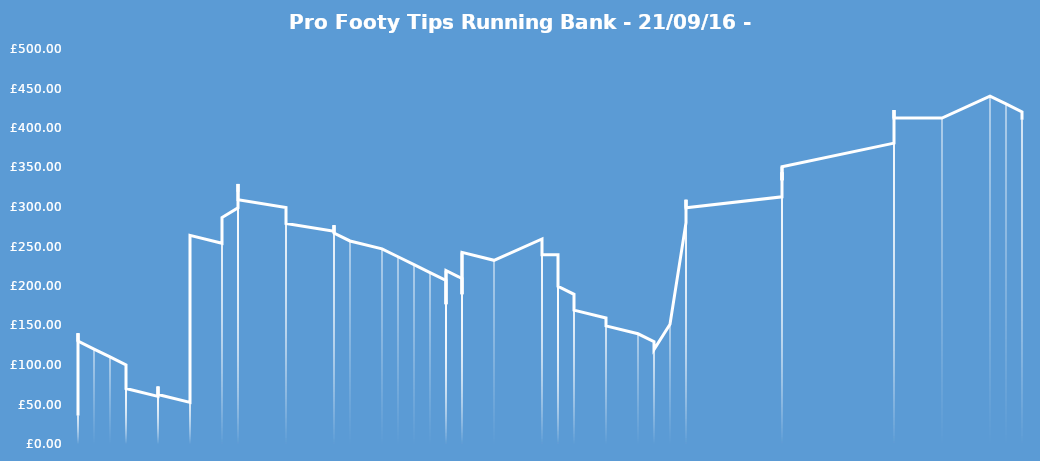
| Category | Running Bank |
|---|---|
| 9/22/16 | 36 |
| 9/22/16 | 49 |
| 9/22/16 | 140.2 |
| 9/22/16 | 140.2 |
| 9/22/16 | 130.2 |
| 9/23/16 | 120.2 |
| 9/24/16 | 110.2 |
| 9/25/16 | 100.2 |
| 9/25/16 | 90.2 |
| 9/25/16 | 80.2 |
| 9/25/16 | 80.2 |
| 9/25/16 | 70.2 |
| 9/27/16 | 60.2 |
| 9/27/16 | 72.7 |
| 9/27/16 | 62.7 |
| 9/27/16 | 62.7 |
| 9/29/16 | 52.7 |
| 9/29/16 | 66.46 |
| 9/29/16 | 121.46 |
| 9/29/16 | 264.16 |
| 9/29/16 | 264.16 |
| 10/1/16 | 254.16 |
| 10/1/16 | 272.16 |
| 10/1/16 | 286.66 |
| 10/2/16 | 298.86 |
| 10/2/16 | 329.26 |
| 10/2/16 | 329.26 |
| 10/2/16 | 319.26 |
| 10/2/16 | 309.26 |
| 10/5/16 | 299.26 |
| 10/5/16 | 289.26 |
| 10/5/16 | 279.26 |
| 10/8/16 | 269.26 |
| 10/8/16 | 277.01 |
| 10/8/16 | 267.01 |
| 10/9/16 | 257.01 |
| 10/11/16 | 247.01 |
| 10/12/16 | 237.01 |
| 10/13/16 | 227.01 |
| 10/14/16 | 217.01 |
| 10/15/16 | 207.01 |
| 10/15/16 | 197.01 |
| 10/15/16 | 187.01 |
| 10/15/16 | 187.01 |
| 10/15/16 | 177.01 |
| 10/15/16 | 219.51 |
| 10/16/16 | 209.51 |
| 10/16/16 | 199.51 |
| 10/16/16 | 189.51 |
| 10/16/16 | 189.51 |
| 10/16/16 | 242.51 |
| 10/18/16 | 232.51 |
| 10/21/16 | 259.51 |
| 10/21/16 | 249.51 |
| 10/21/16 | 239.51 |
| 10/21/16 | 239.51 |
| 10/22/16 | 239.51 |
| 10/22/16 | 229.51 |
| 10/22/16 | 219.51 |
| 10/22/16 | 219.51 |
| 10/22/16 | 209.51 |
| 10/22/16 | 199.51 |
| 10/23/16 | 189.51 |
| 10/23/16 | 179.51 |
| 10/23/16 | 169.51 |
| 10/25/16 | 159.51 |
| 10/25/16 | 149.51 |
| 10/27/16 | 139.51 |
| 10/28/16 | 129.51 |
| 10/28/16 | 119.51 |
| 10/29/16 | 151.51 |
| 10/30/16 | 280.11 |
| 10/30/16 | 280.11 |
| 10/30/16 | 309.11 |
| 10/30/16 | 299.11 |
| 11/5/16 | 312.86 |
| 11/5/16 | 343.86 |
| 11/5/16 | 333.86 |
| 11/5/16 | 350.86 |
| 11/12/16 | 380.86 |
| 11/12/16 | 403.86 |
| 11/12/16 | 422.627 |
| 11/12/16 | 412.627 |
| 11/15/16 | 412.627 |
| 11/18/16 | 440.427 |
| 11/19/16 | 430.427 |
| 11/20/16 | 420.427 |
| 11/20/16 | 410.427 |